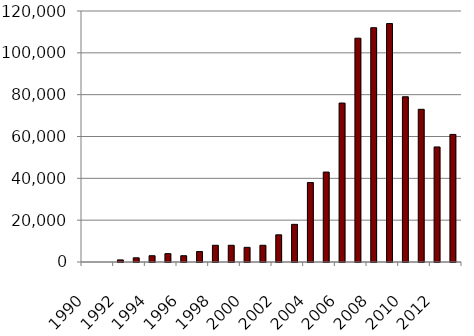
| Category | Series 0 |
|---|---|
| 1990.0 | 0 |
| 1991.0 | 0 |
| 1992.0 | 1000 |
| 1993.0 | 2000 |
| 1994.0 | 3000 |
| 1995.0 | 4000 |
| 1996.0 | 3000 |
| 1997.0 | 5000 |
| 1998.0 | 8000 |
| 1999.0 | 8000 |
| 2000.0 | 7000 |
| 2001.0 | 8000 |
| 2002.0 | 13000 |
| 2003.0 | 18000 |
| 2004.0 | 38000 |
| 2005.0 | 43000 |
| 2006.0 | 76000 |
| 2007.0 | 107000 |
| 2008.0 | 112000 |
| 2009.0 | 114000 |
| 2010.0 | 79000 |
| 2011.0 | 73000 |
| 2012.0 | 55000 |
| 2013.0 | 61000 |